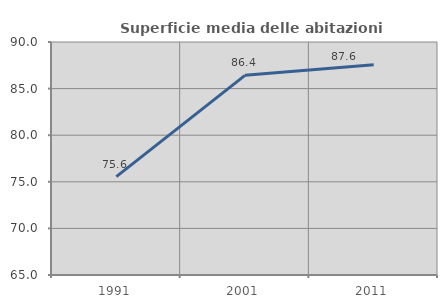
| Category | Superficie media delle abitazioni occupate |
|---|---|
| 1991.0 | 75.555 |
| 2001.0 | 86.425 |
| 2011.0 | 87.563 |